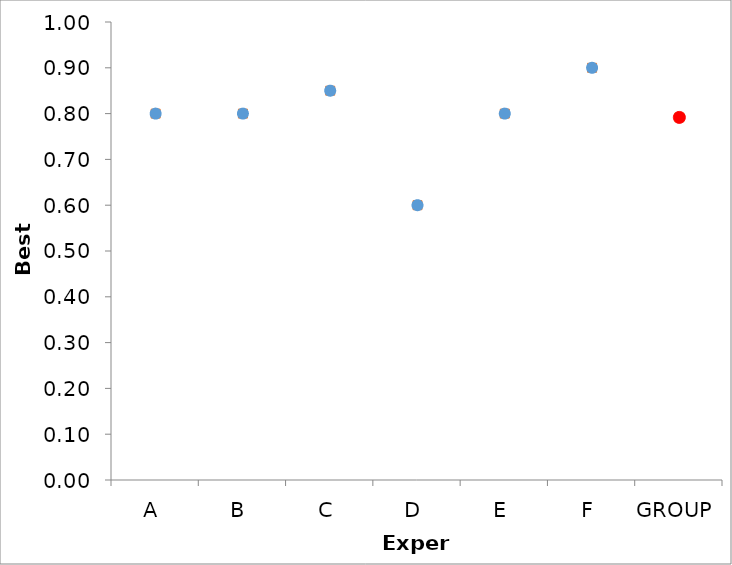
| Category | Series 1 | Series 0 |
|---|---|---|
| A | 0.8 | 0.8 |
| B | 0.8 | 0.8 |
| C | 0.85 | 0.85 |
| D | 0.6 | 0.6 |
| E | 0.8 | 0.8 |
| F | 0.9 | 0.9 |
| GROUP | 0.792 | 0.792 |